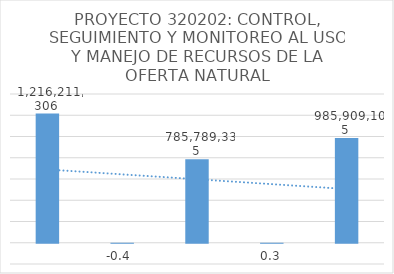
| Category | Series 0 |
|---|---|
| 0 | 1216211306 |
| 1 | -0.354 |
| 2 | 785789334.684 |
| 3 | 0.255 |
| 4 | 985909105 |